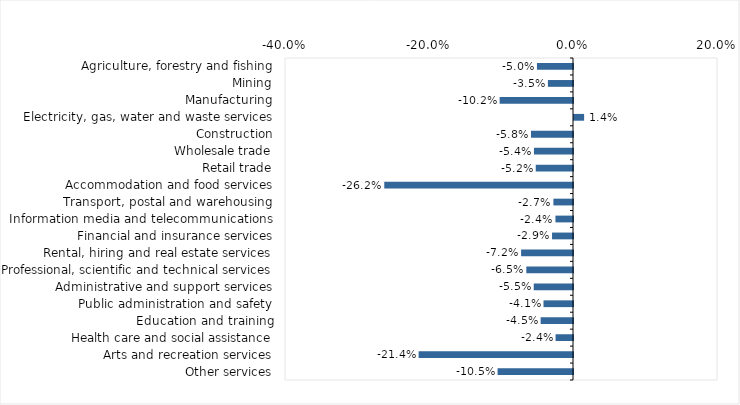
| Category | This week |
|---|---|
| Agriculture, forestry and fishing | -0.05 |
| Mining | -0.035 |
| Manufacturing | -0.102 |
| Electricity, gas, water and waste services | 0.014 |
| Construction | -0.058 |
| Wholesale trade | -0.054 |
| Retail trade | -0.052 |
| Accommodation and food services | -0.262 |
| Transport, postal and warehousing | -0.027 |
| Information media and telecommunications | -0.024 |
| Financial and insurance services | -0.029 |
| Rental, hiring and real estate services | -0.072 |
| Professional, scientific and technical services | -0.065 |
| Administrative and support services | -0.055 |
| Public administration and safety | -0.041 |
| Education and training | -0.045 |
| Health care and social assistance | -0.024 |
| Arts and recreation services | -0.214 |
| Other services | -0.105 |